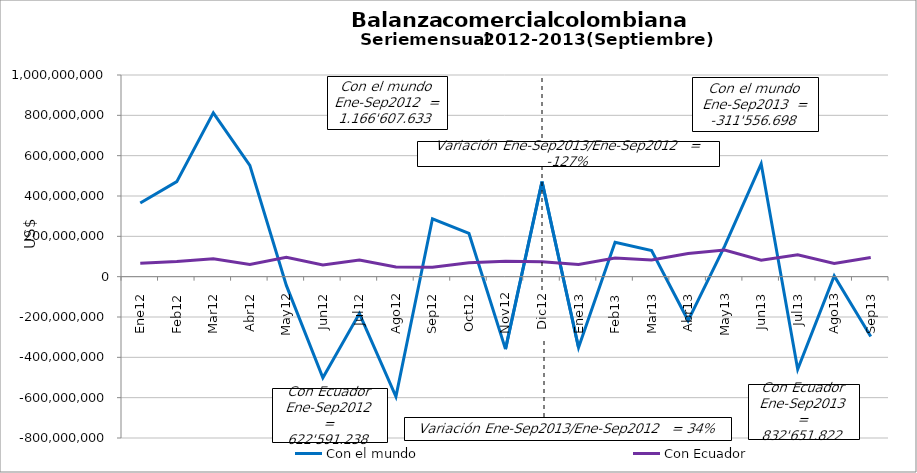
| Category | Con el mundo | Con Ecuador |
|---|---|---|
| 0 | 365236896.39 | 66097890.02 |
| 1 | 471254376.48 | 75448542.37 |
| 2 | 812672155.33 | 89026288.97 |
| 3 | 552212453.87 | 60635196.3 |
| 4 | -43303050.56 | 96426144.55 |
| 5 | -501300545.37 | 58372899.2 |
| 6 | -182769268.25 | 82144329.27 |
| 7 | -594402576.84 | 47723499.34 |
| 8 | 287007192.43 | 46716448.22 |
| 9 | 214327872.41 | 69282264.13 |
| 10 | -359526323.33 | 76734020.53 |
| 11 | 471322651.54 | 73415621.01 |
| 12 | -351699235.93 | 60415567.11 |
| 13 | 170276250.68 | 92568193.41 |
| 14 | 129706117.85 | 82228667.89 |
| 15 | -217650665.27 | 115147006.14 |
| 16 | 151125826.62 | 132139608.57 |
| 17 | 559734024.39 | 81169473.79 |
| 18 | -459551452.93 | 108777321.84 |
| 19 | 3446839.04 | 65169790.36 |
| 20 | -296944402.01 | 95036193.21 |